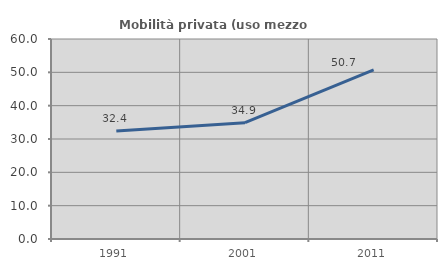
| Category | Mobilità privata (uso mezzo privato) |
|---|---|
| 1991.0 | 32.42 |
| 2001.0 | 34.904 |
| 2011.0 | 50.711 |